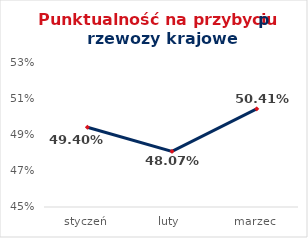
| Category | Series 0 |
|---|---|
| styczeń | 0.494 |
| luty | 0.481 |
| marzec | 0.504 |